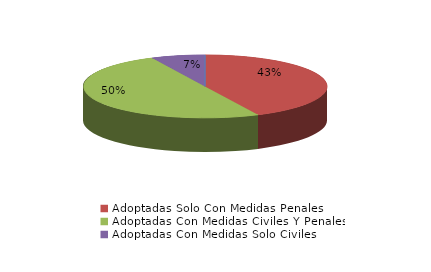
| Category | Series 0 |
|---|---|
| Denegadas | 0 |
| Adoptadas Solo Con Medidas Penales | 72 |
| Adoptadas Con Medidas Civiles Y Penales | 84 |
| Adoptadas Con Medidas Solo Civiles | 12 |